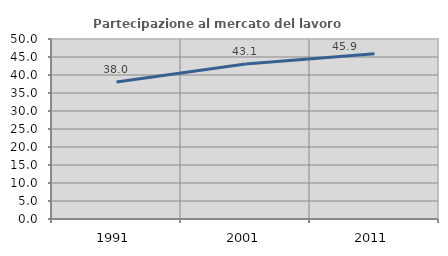
| Category | Partecipazione al mercato del lavoro  femminile |
|---|---|
| 1991.0 | 38.025 |
| 2001.0 | 43.082 |
| 2011.0 | 45.904 |